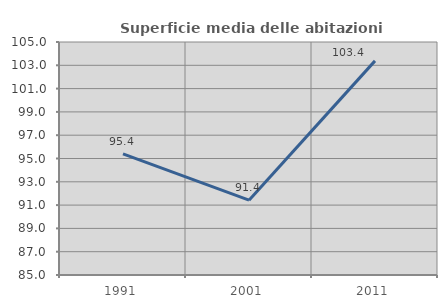
| Category | Superficie media delle abitazioni occupate |
|---|---|
| 1991.0 | 95.4 |
| 2001.0 | 91.426 |
| 2011.0 | 103.379 |